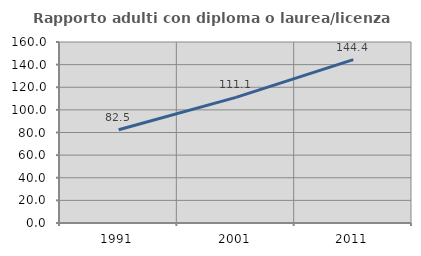
| Category | Rapporto adulti con diploma o laurea/licenza media  |
|---|---|
| 1991.0 | 82.474 |
| 2001.0 | 111.07 |
| 2011.0 | 144.444 |